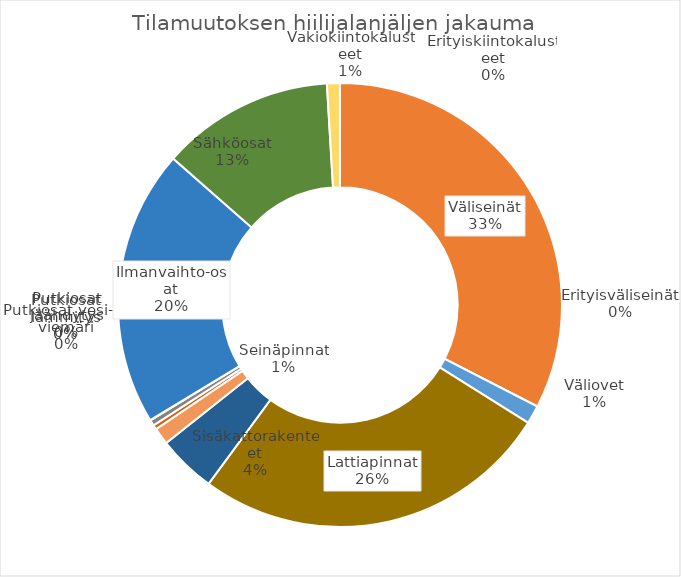
| Category | kg CO2e |
|---|---|
| Ikkunat | 0 |
| Väliseinät | 31425 |
| Lasiväliseinät | 0 |
| Erityisväliseinät | 4 |
| Väliovet | 1293 |
| Erityisovet | 0 |
| Tilaportaat | 0 |
| Erityiset tilajako-osat | 0 |
| Lattioiden pintarakenteet | 0 |
| Lattiapinnat | 25273 |
| Sisäkattorakenteet | 4087 |
| Sisäkattopinnat | 0 |
| Seinien pintarakenteet | 0 |
| Seinäpinnat | 1189 |
| Erityiset tilapinnat | 0 |
| Varusteet | 0 |
| Vakiolaitteet | 0 |
| Hoitotasot ja kulkurakenteet | 0 |
| Tulisijat ja savuhormit | 0 |
| Putkiosat lämmitys | 313 |
| Putkiosat vesi- ja viemäri | 417 |
| Putkiosat jäähdytys | 10 |
| Ilmanvaihto-osat | 19446 |
| Sähköosat | 12154 |
| Tiedonsiirto-osat | 0 |
| Hissit | 0 |
| Tilalaitteet | 0 |
| Vakiokiintokalusteet | 906 |
| Erityiskiintokalusteet | 3 |